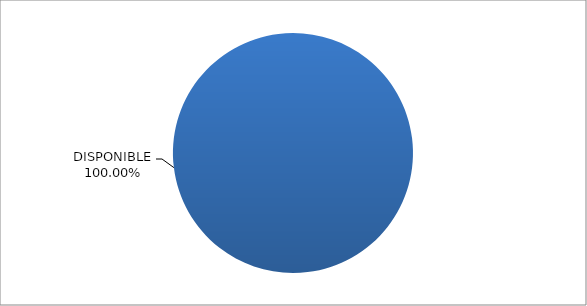
| Category | CODIGO DE AREA 9 |
|---|---|
| DISPONIBLE | 1 |